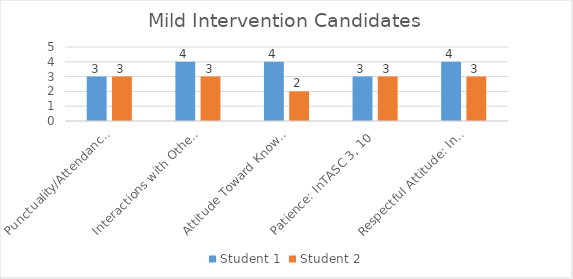
| Category | Student 1 | Student 2 |
|---|---|---|
| Punctuality/Attendance: InTASC 1, 9 | 3 | 3 |
| Interactions with Others: InTASC 3, 7, 10 | 4 | 3 |
| Attitude Toward Knowledge and Learning: InTASC 1, 4, 5, 9, 10 | 4 | 2 |
| Patience: InTASC 3, 10 | 3 | 3 |
| Respectful Attitude: InTASC 3, 7, 10 | 4 | 3 |